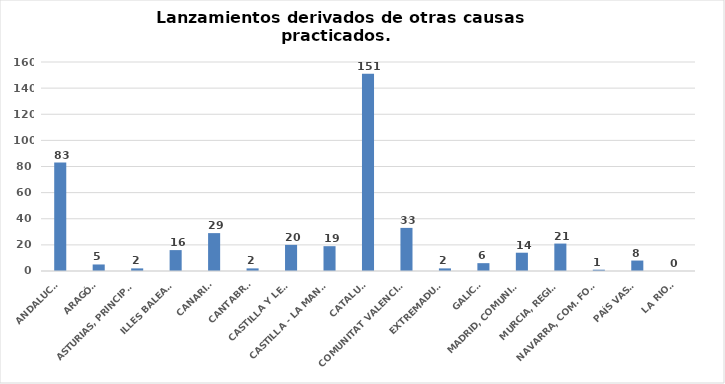
| Category | Series 0 |
|---|---|
| ANDALUCÍA | 83 |
| ARAGÓN | 5 |
| ASTURIAS, PRINCIPADO | 2 |
| ILLES BALEARS | 16 |
| CANARIAS | 29 |
| CANTABRIA | 2 |
| CASTILLA Y LEÓN | 20 |
| CASTILLA - LA MANCHA | 19 |
| CATALUÑA | 151 |
| COMUNITAT VALENCIANA | 33 |
| EXTREMADURA | 2 |
| GALICIA | 6 |
| MADRID, COMUNIDAD | 14 |
| MURCIA, REGIÓN | 21 |
| NAVARRA, COM. FORAL | 1 |
| PAÍS VASCO | 8 |
| LA RIOJA | 0 |